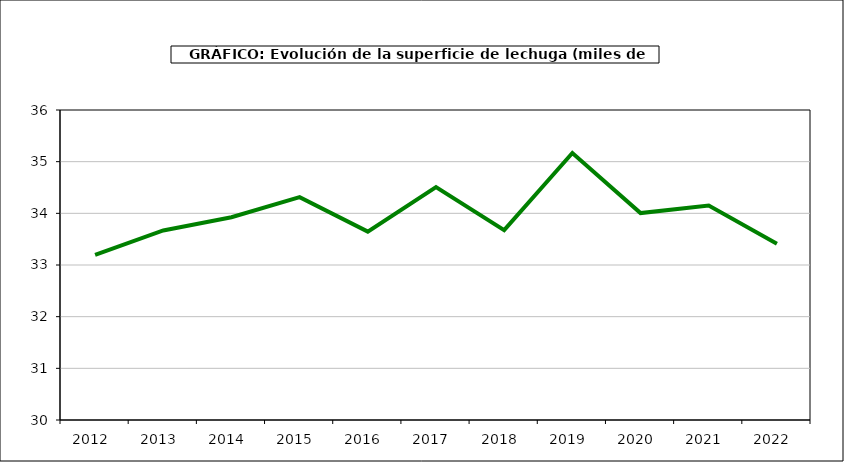
| Category | superficie |
|---|---|
| 2012.0 | 33.196 |
| 2013.0 | 33.669 |
| 2014.0 | 33.924 |
| 2015.0 | 34.314 |
| 2016.0 | 33.646 |
| 2017.0 | 34.508 |
| 2018.0 | 33.674 |
| 2019.0 | 35.168 |
| 2020.0 | 34.005 |
| 2021.0 | 34.15 |
| 2022.0 | 33.411 |